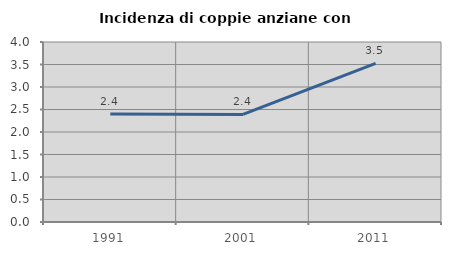
| Category | Incidenza di coppie anziane con figli |
|---|---|
| 1991.0 | 2.402 |
| 2001.0 | 2.391 |
| 2011.0 | 3.524 |